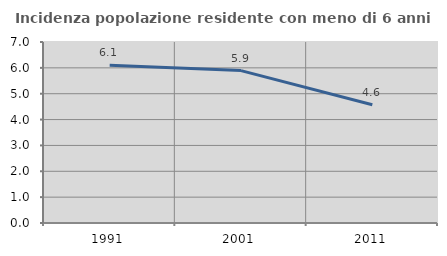
| Category | Incidenza popolazione residente con meno di 6 anni |
|---|---|
| 1991.0 | 6.098 |
| 2001.0 | 5.894 |
| 2011.0 | 4.574 |